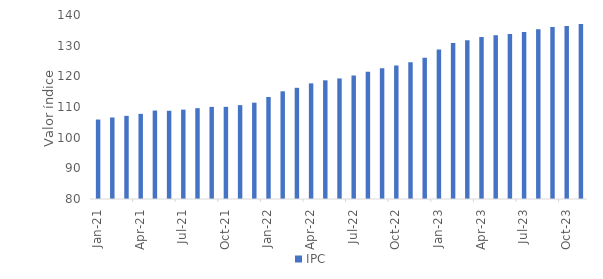
| Category | IPC |
|---|---|
| 2021-01-01 | 105.91 |
| 2021-02-01 | 106.58 |
| 2021-03-01 | 107.12 |
| 2021-04-01 | 107.76 |
| 2021-05-01 | 108.84 |
| 2021-06-01 | 108.78 |
| 2021-07-01 | 109.14 |
| 2021-08-01 | 109.62 |
| 2021-09-01 | 110.04 |
| 2021-10-01 | 110.06 |
| 2021-11-01 | 110.6 |
| 2021-12-01 | 111.41 |
| 2022-01-01 | 113.26 |
| 2022-02-01 | 115.11 |
| 2022-03-01 | 116.26 |
| 2022-04-01 | 117.71 |
| 2022-05-01 | 118.7 |
| 2022-06-01 | 119.31 |
| 2022-07-01 | 120.27 |
| 2022-08-01 | 121.5 |
| 2022-09-01 | 122.63 |
| 2022-10-01 | 123.51 |
| 2022-11-01 | 124.59 |
| 2022-12-01 | 126.03 |
| 2023-01-01 | 128.76 |
| 2023-02-01 | 130.87 |
| 2023-03-01 | 131.77 |
| 2023-04-01 | 132.8 |
| 2023-05-01 | 133.38 |
| 2023-06-01 | 133.78 |
| 2023-07-01 | 134.45 |
| 2023-08-01 | 135.39 |
| 2023-09-01 | 136.11 |
| 2023-10-01 | 136.45 |
| 2023-11-01 | 137.09 |